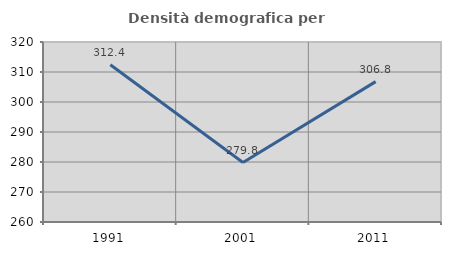
| Category | Densità demografica |
|---|---|
| 1991.0 | 312.429 |
| 2001.0 | 279.807 |
| 2011.0 | 306.798 |